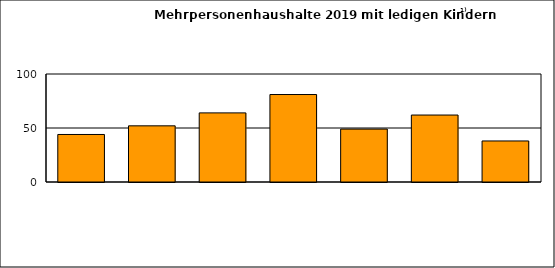
| Category | Series 0 |
|---|---|
| 0 | 44 |
| 1 | 52 |
| 2 | 64 |
| 3 | 81 |
| 4 | 49 |
| 5 | 62 |
| 6 | 38 |